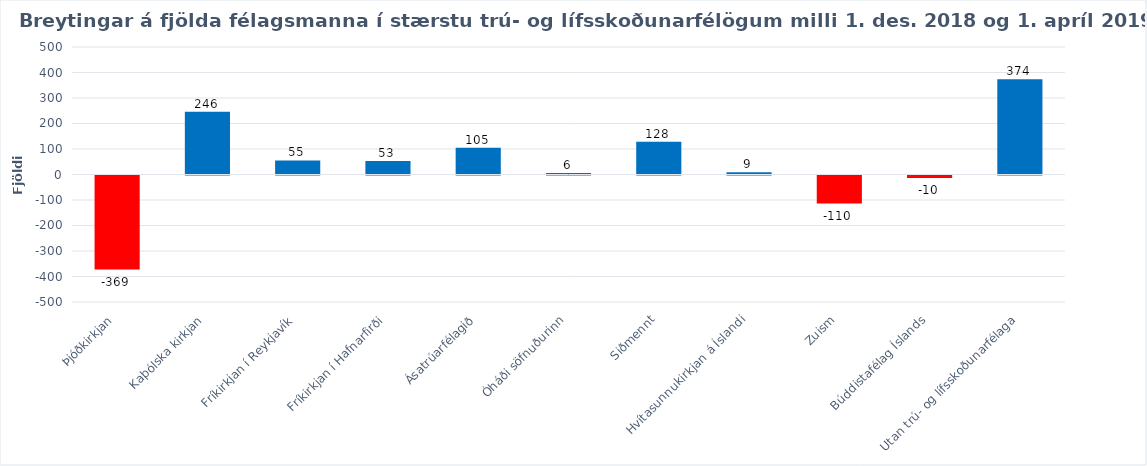
| Category | Series 0 |
|---|---|
| Þjóðkirkjan | -369 |
| Kaþólska kirkjan | 246 |
| Fríkirkjan í Reykjavík | 55 |
| Fríkirkjan í Hafnarfirði | 53 |
| Ásatrúarfélagið | 105 |
| Óháði söfnuðurinn | 6 |
| Siðmennt | 128 |
| Hvítasunnukirkjan á Íslandi | 9 |
| Zuism | -110 |
| Búddistafélag Íslands | -10 |
| Utan trú- og lífsskoðunarfélaga | 374 |